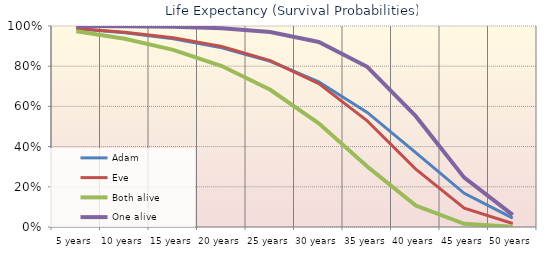
| Category | Adam | Eve | Both alive | One alive |
|---|---|---|---|---|
| 5 years | 0.987 | 0.988 | 0.974 | 1 |
| 10 years | 0.967 | 0.969 | 0.936 | 0.999 |
| 15 years | 0.937 | 0.941 | 0.881 | 0.996 |
| 20 years | 0.892 | 0.898 | 0.801 | 0.989 |
| 25 years | 0.825 | 0.828 | 0.683 | 0.97 |
| 30 years | 0.723 | 0.713 | 0.516 | 0.921 |
| 35 years | 0.57 | 0.528 | 0.301 | 0.797 |
| 40 years | 0.37 | 0.288 | 0.107 | 0.551 |
| 45 years | 0.168 | 0.093 | 0.016 | 0.245 |
| 50 years | 0.044 | 0.017 | 0.001 | 0.06 |